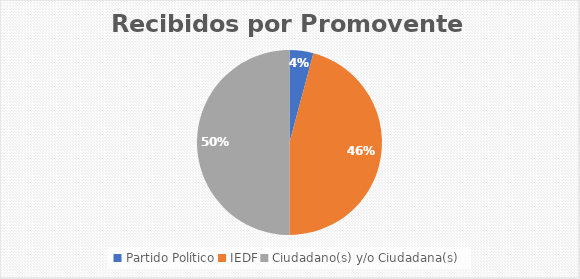
| Category | Series 0 |
|---|---|
| Partido Político | 1 |
| IEDF | 11 |
| Ciudadano(s) y/o Ciudadana(s) | 12 |